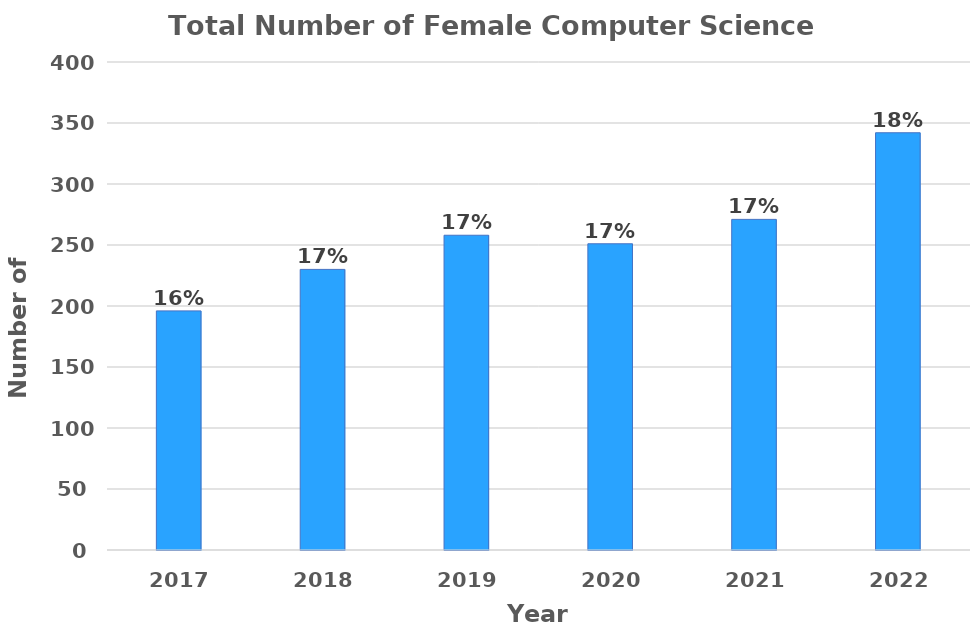
| Category | Total Number of Females |
|---|---|
| 2017.0 | 196 |
| 2018.0 | 230 |
| 2019.0 | 258 |
| 2020.0 | 251 |
| 2021.0 | 271 |
| 2022.0 | 342 |